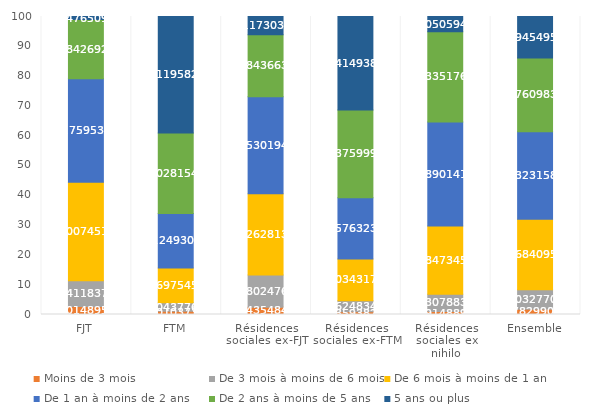
| Category | Moins de 3 mois | De 3 mois à moins de 6 mois | De 6 mois à moins de 1 an | De 1 an à moins de 2 ans | De 2 ans à moins de 5 ans | 5 ans ou plus |
|---|---|---|---|---|---|---|
| FJT | 2.701 | 8.641 | 33.007 | 34.76 | 19.843 | 1.048 |
| FTM | 1.101 | 2.804 | 11.698 | 18.249 | 27.028 | 39.12 |
| Résidences sociales ex-FJT | 2.444 | 10.802 | 27.263 | 32.53 | 20.844 | 6.117 |
| Résidences sociales ex-FTM | 0.936 | 3.662 | 14.034 | 20.576 | 29.376 | 31.415 |
| Résidences sociales ex nihilo | 0.991 | 5.831 | 22.847 | 34.89 | 30.335 | 5.105 |
| Ensemble | 1.783 | 6.503 | 23.684 | 29.323 | 24.761 | 13.945 |